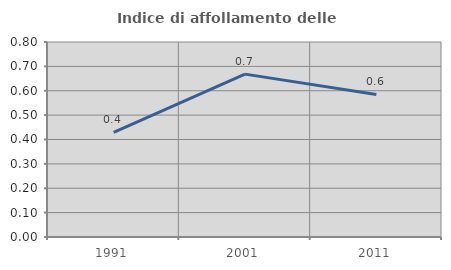
| Category | Indice di affollamento delle abitazioni  |
|---|---|
| 1991.0 | 0.429 |
| 2001.0 | 0.668 |
| 2011.0 | 0.585 |